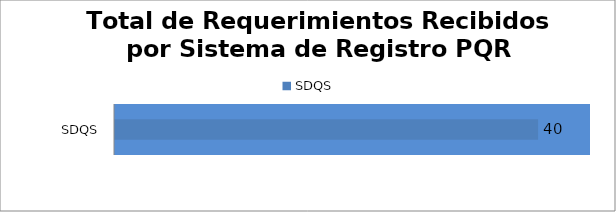
| Category | Total |
|---|---|
| SDQS | 40 |